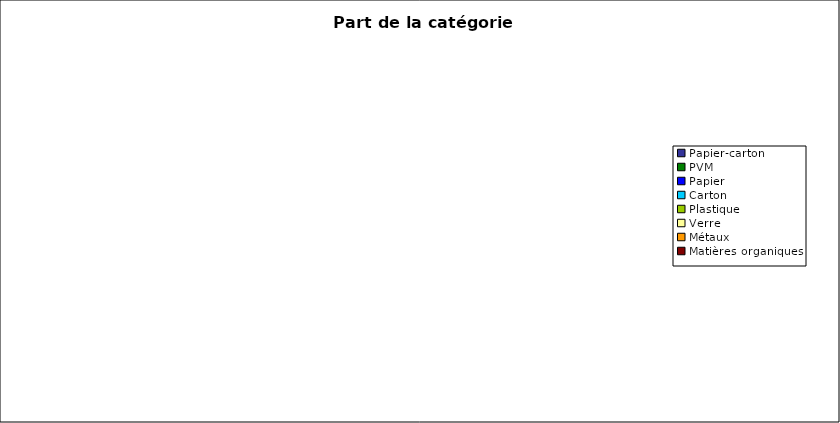
| Category | Part de la catégorie (%) |
|---|---|
| Papier-carton | 0 |
| PVM | 0 |
| Papier | 0 |
| Carton | 0 |
| Plastique | 0 |
| Verre | 0 |
| Métaux | 0 |
| Matières organiques | 0 |